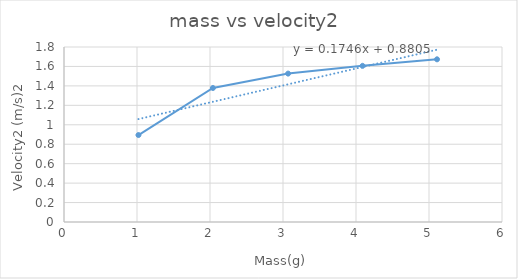
| Category | velocity 2 (m/s)2 |
|---|---|
| 1.02 | 0.894 |
| 2.04 | 1.378 |
| 3.07 | 1.526 |
| 4.09 | 1.606 |
| 5.11 | 1.673 |